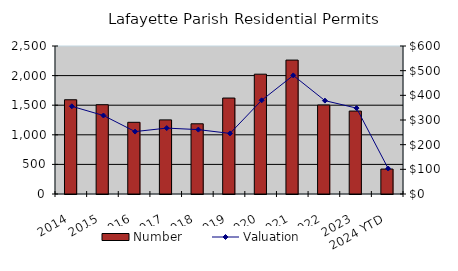
| Category | Number |
|---|---|
| 2014 | 1592 |
| 2015 | 1508 |
| 2016 | 1211 |
| 2017 | 1252 |
| 2018 | 1186 |
| 2019 | 1621 |
| 2020 | 2024 |
| 2021 | 2262 |
| 2022 | 1503 |
| 2023 | 1401 |
| 2024 YTD | 421 |